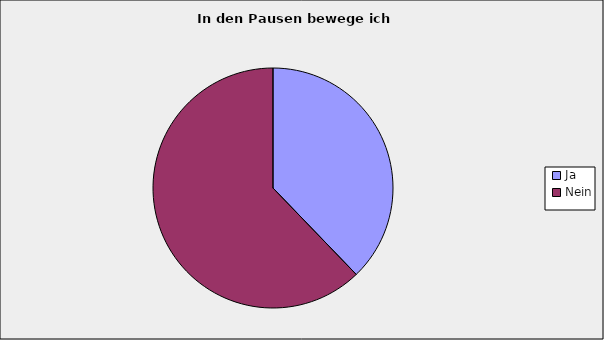
| Category | Series 0 |
|---|---|
| Ja | 0.378 |
| Nein | 0.622 |